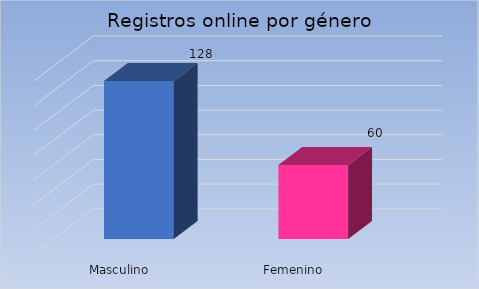
| Category | Cantidad |
|---|---|
| Masculino | 128 |
| Femenino | 60 |